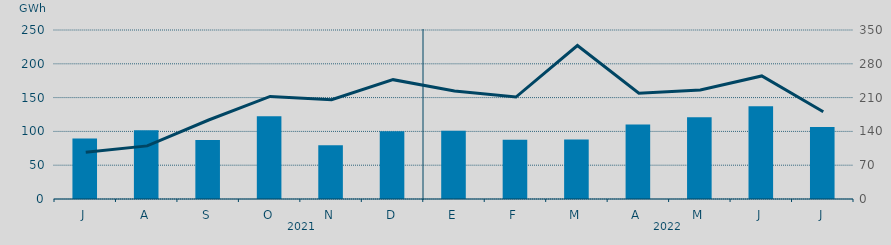
| Category | Energía a subir |
|---|---|
| J | 89.657 |
| A | 101.876 |
| S | 87.125 |
| O | 122.328 |
| N | 79.438 |
| D | 100.154 |
| E | 100.885 |
| F | 87.769 |
| M | 87.943 |
| A | 110.173 |
| M | 120.934 |
| J | 137.327 |
| J | 106.625 |